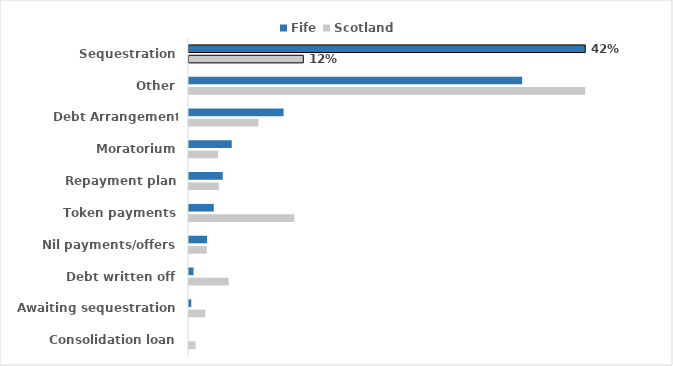
| Category | Fife | Scotland |
|---|---|---|
| Sequestration | 0.417 | 0.12 |
| Other | 0.351 | 0.417 |
| Debt Arrangement Scheme | 0.1 | 0.073 |
| Moratorium | 0.045 | 0.031 |
| Repayment plan | 0.036 | 0.031 |
| Token payments | 0.026 | 0.111 |
| Nil payments/offers | 0.019 | 0.019 |
| Debt written off | 0.005 | 0.042 |
| Awaiting sequestration | 0.002 | 0.017 |
| Consolidation loan | 0 | 0.007 |